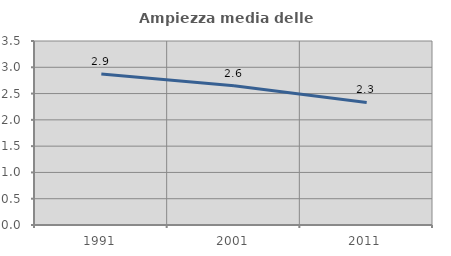
| Category | Ampiezza media delle famiglie |
|---|---|
| 1991.0 | 2.873 |
| 2001.0 | 2.647 |
| 2011.0 | 2.331 |